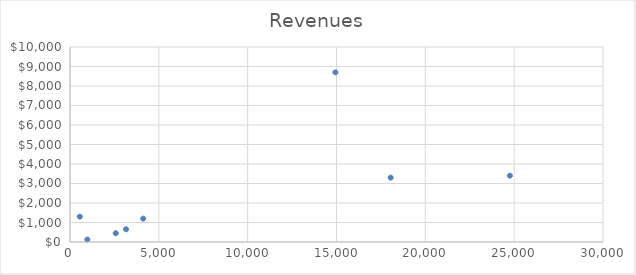
| Category | Revenues |
|---|---|
| 24757.0 | 3400 |
| 552.0 | 1300 |
| 3154.0 | 653 |
| 2577.0 | 450 |
| 976.0 | 127 |
| 18050.0 | 3300 |
| 4118.0 | 1200 |
| 14936.0 | 8700 |